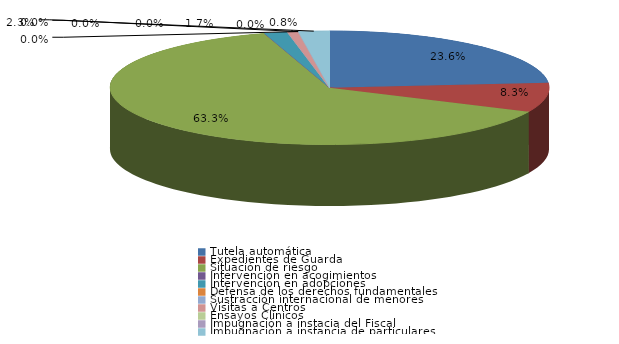
| Category | Series 0 |
|---|---|
| Tutela automática | 207 |
| Expedientes de Guarda | 73 |
| Situación de riesgo | 555 |
| Intervención en acogimientos | 0 |
| Intervención en adopciones | 15 |
| Defensa de los derechos fundamentales | 0 |
| Sustracción internacional de menores | 0 |
| Visitas a Centros | 7 |
| Ensayos Clínicos | 0 |
| Impugnación a instacia del Fiscal | 0 |
| Impugnación a instancia de particulares | 20 |